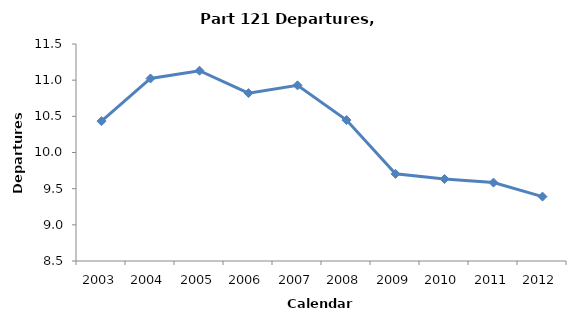
| Category | Departures (millions) |
|---|---|
| 2003.0 | 10.433 |
| 2004.0 | 11.023 |
| 2005.0 | 11.13 |
| 2006.0 | 10.821 |
| 2007.0 | 10.928 |
| 2008.0 | 10.448 |
| 2009.0 | 9.705 |
| 2010.0 | 9.634 |
| 2011.0 | 9.584 |
| 2012.0 | 9.391 |